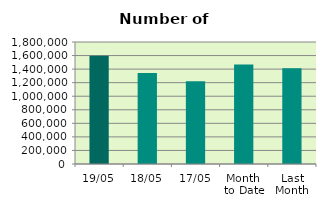
| Category | Series 0 |
|---|---|
| 19/05 | 1598946 |
| 18/05 | 1341170 |
| 17/05 | 1221362 |
| Month 
to Date | 1469354.462 |
| Last
Month | 1414476.2 |